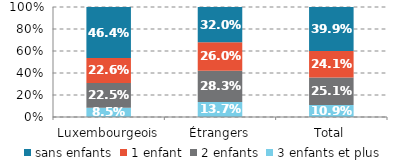
| Category | 3 enfants et plus | 2 enfants | 1 enfant | sans enfants |
|---|---|---|---|---|
| Luxembourgeois | 0.085 | 0.225 | 0.226 | 0.464 |
| Étrangers | 0.137 | 0.283 | 0.26 | 0.32 |
| Total | 0.109 | 0.251 | 0.241 | 0.399 |